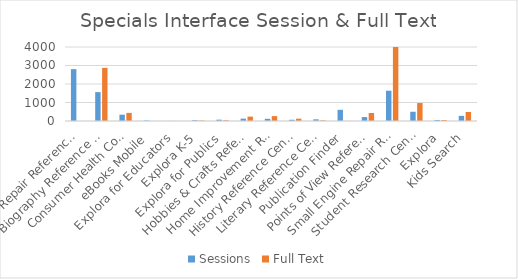
| Category | Sessions | Full Text |
|---|---|---|
| Auto Repair Reference Center | 2803 | 0 |
| Biography Reference Center | 1561 | 2874 |
| Consumer Health Complete | 341 | 438 |
| eBooks Mobile | 27 | 0 |
| Explora for Educators | 3 | 0 |
| Explora K-5 | 45 | 26 |
| Explora for Publics | 72 | 42 |
| Hobbies & Crafts Reference Center | 128 | 237 |
| Home Improvement Reference Center | 118 | 264 |
| History Reference Center | 67 | 124 |
| Literary Reference Center / LRC Plus | 90 | 35 |
| Publication Finder | 605 | 2 |
| Points of View Reference Center | 213 | 434 |
| Small Engine Repair Reference Center | 1637 | 5033 |
| Student Research Center | 499 | 971 |
| Explora | 56 | 52 |
| Kids Search | 277 | 487 |